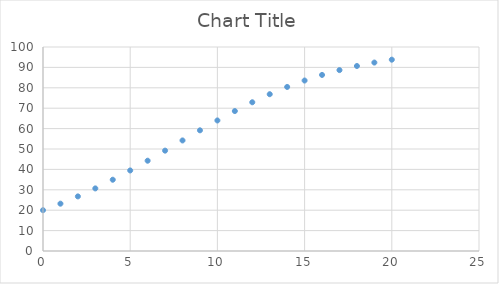
| Category | Series 0 |
|---|---|
| 0.0 | 20 |
| 1.0 | 23.2 |
| 2.0 | 26.764 |
| 3.0 | 30.684 |
| 4.0 | 34.937 |
| 5.0 | 39.484 |
| 6.0 | 44.262 |
| 7.0 | 49.197 |
| 8.0 | 54.195 |
| 9.0 | 59.16 |
| 10.0 | 63.992 |
| 11.0 | 68.601 |
| 12.0 | 72.909 |
| 13.0 | 76.859 |
| 14.0 | 80.416 |
| 15.0 | 83.566 |
| 16.0 | 86.313 |
| 17.0 | 88.675 |
| 18.0 | 90.684 |
| 19.0 | 92.374 |
| 20.0 | 93.782 |